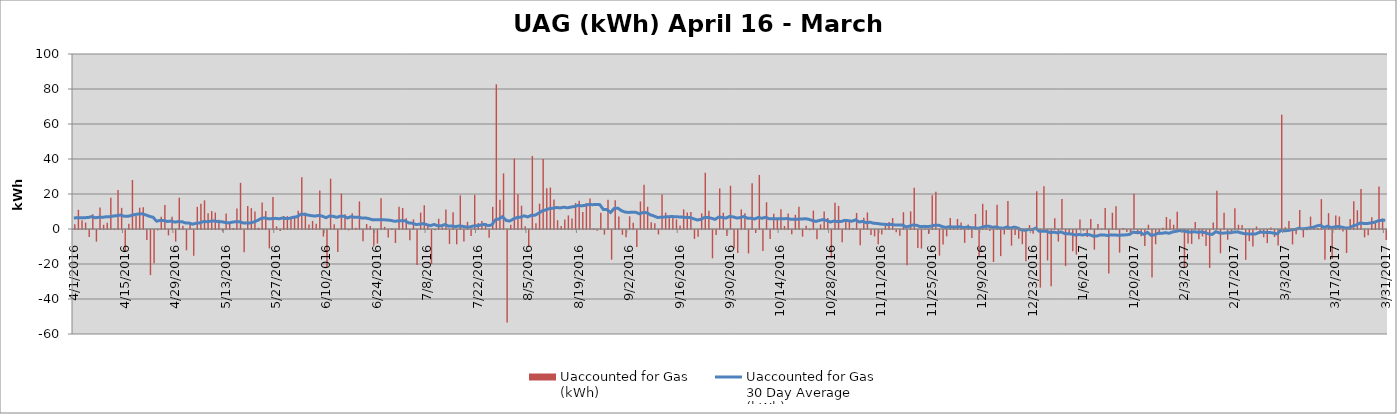
| Category | Uaccounted for Gas 
(kWh) |
|---|---|
| 4/1/16 | 2747858 |
| 4/2/16 | 10987249 |
| 4/3/16 | 4971341 |
| 4/4/16 | 3717906 |
| 4/5/16 | -4013065.802 |
| 4/6/16 | 8357660 |
| 4/7/16 | -6666343 |
| 4/8/16 | 12330200.741 |
| 4/9/16 | 2411081 |
| 4/10/16 | 3610171 |
| 4/11/16 | 17916954 |
| 4/12/16 | -39979.679 |
| 4/13/16 | 22291129 |
| 4/14/16 | 12089341 |
| 4/15/16 | -12388308.773 |
| 4/16/16 | 2954956 |
| 4/17/16 | 28032356 |
| 4/18/16 | 7630106 |
| 4/19/16 | 12194986 |
| 4/20/16 | 12359151 |
| 4/21/16 | -5673006 |
| 4/22/16 | -25780924.809 |
| 4/23/16 | -18972085 |
| 4/24/16 | -218906 |
| 4/25/16 | 6956983 |
| 4/26/16 | 13717920.634 |
| 4/27/16 | -3056522.309 |
| 4/28/16 | 6942178.857 |
| 4/29/16 | -6624262 |
| 4/30/16 | 17928392 |
| 5/1/16 | 1872096 |
| 5/2/16 | -11613748 |
| 5/3/16 | 2883097 |
| 5/4/16 | -14722521 |
| 5/5/16 | 12671728 |
| 5/6/16 | 14473853 |
| 5/7/16 | 16383154 |
| 5/8/16 | 9026183 |
| 5/9/16 | 10286304 |
| 5/10/16 | 9417301 |
| 5/11/16 | 5223985 |
| 5/12/16 | -739234 |
| 5/13/16 | 8892697.646 |
| 5/14/16 | 4005316 |
| 5/15/16 | 564509 |
| 5/16/16 | 11779407 |
| 5/17/16 | 26385147 |
| 5/18/16 | -12736341 |
| 5/19/16 | 13194191 |
| 5/20/16 | 11895440 |
| 5/21/16 | 10004135 |
| 5/22/16 | 726040 |
| 5/23/16 | 15123490 |
| 5/24/16 | 10237784 |
| 5/25/16 | -10526853 |
| 5/26/16 | 18323500 |
| 5/27/16 | 1508032 |
| 5/28/16 | -591883 |
| 5/29/16 | 7375942 |
| 5/30/16 | 7362594 |
| 5/31/16 | 7012977 |
| 6/1/16 | 6890521 |
| 6/2/16 | 10470917 |
| 6/3/16 | 29588070 |
| 6/4/16 | 9401068 |
| 6/5/16 | 2630983 |
| 6/6/16 | 4656331 |
| 6/7/16 | 3021136 |
| 6/8/16 | 21973435 |
| 6/9/16 | -3748070 |
| 6/10/16 | -21179469 |
| 6/11/16 | 28727680 |
| 6/12/16 | 2666875 |
| 6/13/16 | -12593680 |
| 6/14/16 | 20233542 |
| 6/15/16 | 8492768 |
| 6/16/16 | -226227 |
| 6/17/16 | 9038433 |
| 6/18/16 | 758960 |
| 6/19/16 | 15768394 |
| 6/20/16 | -6391839 |
| 6/21/16 | 2816300 |
| 6/22/16 | 1705206.528 |
| 6/23/16 | -8959810.446 |
| 6/24/16 | -7756670 |
| 6/25/16 | 17546263 |
| 6/26/16 | 1254748 |
| 6/27/16 | -4295473 |
| 6/28/16 | 274793 |
| 6/29/16 | -7430974 |
| 6/30/16 | 12727594 |
| 7/1/16 | 12029868 |
| 7/2/16 | 6184016 |
| 7/3/16 | -5812940 |
| 7/4/16 | 5537119.443 |
| 7/5/16 | -19944678.051 |
| 7/6/16 | 9367939 |
| 7/7/16 | 13509380 |
| 7/8/16 | 2721775 |
| 7/9/16 | -19496157 |
| 7/10/16 | -211371 |
| 7/11/16 | 5857602 |
| 7/12/16 | 904832 |
| 7/13/16 | 11076993 |
| 7/14/16 | -7954483 |
| 7/15/16 | 9577253.08 |
| 7/16/16 | -8204924.693 |
| 7/17/16 | 19206296 |
| 7/18/16 | -6580375 |
| 7/19/16 | 4109836.923 |
| 7/20/16 | -3361608 |
| 7/21/16 | 19554120.958 |
| 7/22/16 | 3427693 |
| 7/23/16 | 4627939 |
| 7/24/16 | 3361810 |
| 7/25/16 | -4417997 |
| 7/26/16 | 12638248.667 |
| 7/27/16 | 82671558.278 |
| 7/28/16 | 16765015.111 |
| 7/29/16 | 31766399.556 |
| 7/30/16 | -52867549.333 |
| 7/31/16 | 2458429.722 |
| 8/1/16 | 40289807.083 |
| 8/2/16 | 19871955.028 |
| 8/3/16 | 13271605.361 |
| 8/4/16 | 1631152.944 |
| 8/5/16 | -9380200.417 |
| 8/6/16 | 41777608.028 |
| 8/7/16 | 3333806.778 |
| 8/8/16 | 14466058.611 |
| 8/9/16 | 40070202.222 |
| 8/10/16 | 23232889.944 |
| 8/11/16 | 23718036.611 |
| 8/12/16 | 16890076.056 |
| 8/13/16 | 5003762.833 |
| 8/14/16 | 1677302.389 |
| 8/15/16 | 5374627 |
| 8/16/16 | 7755333.5 |
| 8/17/16 | 6011751.611 |
| 8/18/16 | 14825873.333 |
| 8/19/16 | 16162521.833 |
| 8/20/16 | 9664023.889 |
| 8/21/16 | 14803472.5 |
| 8/22/16 | 17424841.151 |
| 8/23/16 | 251739.523 |
| 8/24/16 | -478101.105 |
| 8/25/16 | 9270874.175 |
| 8/26/16 | -2667414.92 |
| 8/27/16 | 16658694.802 |
| 8/28/16 | -16956096.667 |
| 8/29/16 | 16443772.947 |
| 8/30/16 | 7195898.949 |
| 8/31/16 | -2754980.252 |
| 9/1/16 | -4195728.347 |
| 9/2/16 | 7236869.482 |
| 9/3/16 | 3530846.556 |
| 9/4/16 | -9665146.301 |
| 9/5/16 | 15741645.858 |
| 9/6/16 | 25313352.514 |
| 9/7/16 | 12705757.011 |
| 9/8/16 | 3788272.597 |
| 9/9/16 | 3297311.931 |
| 9/10/16 | -2533696.758 |
| 9/11/16 | 19719957.8 |
| 9/12/16 | 9356695.248 |
| 9/13/16 | 7552068.194 |
| 9/14/16 | 7603537.636 |
| 9/15/16 | 5495453.333 |
| 9/16/16 | 2036538.991 |
| 9/17/16 | 11188610.071 |
| 9/18/16 | 9389365.087 |
| 9/19/16 | 9672062.644 |
| 9/20/16 | -5108918.222 |
| 9/21/16 | -3874894.293 |
| 9/22/16 | 8962838.944 |
| 9/23/16 | 32136790.639 |
| 9/24/16 | 10379700.556 |
| 9/25/16 | -16176274.139 |
| 9/26/16 | -2796131.695 |
| 9/27/16 | 23202057.527 |
| 9/28/16 | 9304400.043 |
| 9/29/16 | -3482010.228 |
| 9/30/16 | 24695513.708 |
| 10/1/16 | -10562901.728 |
| 10/2/16 | -13121929.444 |
| 10/3/16 | 11217482.773 |
| 10/4/16 | 9004987.5 |
| 10/5/16 | -13353679.568 |
| 10/6/16 | 26145448.007 |
| 10/7/16 | -1705756.222 |
| 10/8/16 | 30890607.889 |
| 10/9/16 | -11976613.333 |
| 10/10/16 | 15303461.056 |
| 10/11/16 | -5214165.389 |
| 10/12/16 | 8710887.889 |
| 10/13/16 | 6194697.167 |
| 10/14/16 | 11256169.389 |
| 10/15/16 | 1683467 |
| 10/16/16 | 8926823.389 |
| 10/17/16 | -2366819.722 |
| 10/18/16 | 8116603.111 |
| 10/19/16 | 12738192.389 |
| 10/20/16 | -3812741.631 |
| 10/21/16 | 1914863.633 |
| 10/22/16 | -161652.778 |
| 10/23/16 | 10530595.889 |
| 10/24/16 | -5349969.937 |
| 10/25/16 | 2613667.463 |
| 10/26/16 | 10066118.722 |
| 10/27/16 | 6353070.5 |
| 10/28/16 | -16023222.611 |
| 10/29/16 | 14956836.778 |
| 10/30/16 | 13196413.833 |
| 10/31/16 | -6951657 |
| 11/1/16 | 5590893.889 |
| 11/2/16 | 4896630.278 |
| 11/3/16 | 447556.111 |
| 11/4/16 | 9182955.611 |
| 11/5/16 | -8645903.5 |
| 11/6/16 | 6452780.5 |
| 11/7/16 | 9427150.611 |
| 11/8/16 | -2874319.5 |
| 11/9/16 | -3628275.5 |
| 11/10/16 | -8122816.778 |
| 11/11/16 | -2500252.389 |
| 11/12/16 | 3051498.222 |
| 11/13/16 | 3997684.222 |
| 11/14/16 | 6257648.278 |
| 11/15/16 | -1322268.333 |
| 11/16/16 | -3276376.222 |
| 11/17/16 | 9587427.389 |
| 11/18/16 | -20136285.111 |
| 11/19/16 | 10048616 |
| 11/20/16 | 23569442.556 |
| 11/21/16 | -10239526.167 |
| 11/22/16 | -10604980.278 |
| 11/23/16 | -54751.611 |
| 11/24/16 | -2303136.333 |
| 11/25/16 | 19271363.167 |
| 11/26/16 | 21318233.722 |
| 11/27/16 | -14671256.444 |
| 11/28/16 | -8230982.111 |
| 11/29/16 | -3622603.944 |
| 11/30/16 | 6319067.389 |
| 12/1/16 | 1309623.333 |
| 12/2/16 | 5757946.889 |
| 12/3/16 | 3761495.833 |
| 12/4/16 | -7365564.111 |
| 12/5/16 | 2528649.333 |
| 12/6/16 | -4523977.833 |
| 12/7/16 | 8630032.944 |
| 12/8/16 | -15113093.056 |
| 12/9/16 | 14363784 |
| 12/10/16 | 10765758.722 |
| 12/11/16 | -610812.667 |
| 12/12/16 | -18256860.722 |
| 12/13/16 | 13810599.944 |
| 12/14/16 | -14926308.5 |
| 12/15/16 | -2545649.333 |
| 12/16/16 | 15974253 |
| 12/17/16 | -8980636.556 |
| 12/18/16 | -2843949.444 |
| 12/19/16 | -4984360.278 |
| 12/20/16 | -8115099.556 |
| 12/21/16 | -17829129.333 |
| 12/22/16 | 2263688.889 |
| 12/23/16 | -2115083.222 |
| 12/24/16 | 21535314.667 |
| 12/25/16 | -32939537.944 |
| 12/26/16 | 24433434.222 |
| 12/27/16 | -17432856.5 |
| 12/28/16 | -32169774.444 |
| 12/29/16 | 6183195.667 |
| 12/30/16 | -6596187.389 |
| 12/31/16 | 17134252.111 |
| 1/1/17 | -20597397.944 |
| 1/2/17 | -2104624.111 |
| 1/3/17 | -12181685 |
| 1/4/17 | -14084543 |
| 1/5/17 | 5406819.222 |
| 1/6/17 | -414795.111 |
| 1/7/17 | -4011371.667 |
| 1/8/17 | 5710766.389 |
| 1/9/17 | -11202968 |
| 1/10/17 | 2853704.889 |
| 1/11/17 | 155040.167 |
| 1/12/17 | 11998996.222 |
| 1/13/17 | -24865163.823 |
| 1/14/17 | 9316219.444 |
| 1/15/17 | 12975733.556 |
| 1/16/17 | -12947537 |
| 1/17/17 | 614870.799 |
| 1/18/17 | -1112403.045 |
| 1/19/17 | -1563743.167 |
| 1/20/17 | 20206608.278 |
| 1/21/17 | -2480853.667 |
| 1/22/17 | -3614935.444 |
| 1/23/17 | -9171226.333 |
| 1/24/17 | 2443619.222 |
| 1/25/17 | -27085630.48 |
| 1/26/17 | -8171554.722 |
| 1/27/17 | -2760229.778 |
| 1/28/17 | 755709.222 |
| 1/29/17 | 6855057.222 |
| 1/30/17 | 5562082.944 |
| 1/31/17 | 2441500.833 |
| 2/1/17 | 9864224 |
| 2/2/17 | -158717.305 |
| 2/3/17 | -21634432.064 |
| 2/4/17 | -7778160.925 |
| 2/5/17 | -7950045.818 |
| 2/6/17 | 4017711.428 |
| 2/7/17 | -5275144.515 |
| 2/8/17 | -3656474.611 |
| 2/9/17 | -9147257.556 |
| 2/10/17 | -21684557.611 |
| 2/11/17 | 3704956.167 |
| 2/12/17 | 21887261.389 |
| 2/13/17 | -13284116.889 |
| 2/14/17 | 9239228.944 |
| 2/15/17 | -5586096 |
| 2/16/17 | -649950.222 |
| 2/17/17 | 11881322.611 |
| 2/18/17 | 2426477.778 |
| 2/19/17 | 2282367.389 |
| 2/20/17 | -17048555.667 |
| 2/21/17 | -6382876.056 |
| 2/22/17 | -9457200.5 |
| 2/23/17 | 1430377.889 |
| 2/24/17 | -537241.667 |
| 2/25/17 | -4167016.556 |
| 2/26/17 | -7478267.444 |
| 2/27/17 | 809297.111 |
| 2/28/17 | -3983837.778 |
| 3/1/17 | -8866071.111 |
| 3/2/17 | 65320505.056 |
| 3/3/17 | 1046184.278 |
| 3/4/17 | 4526122.444 |
| 3/5/17 | -8227600.556 |
| 3/6/17 | -2463328.444 |
| 3/7/17 | 10811047.611 |
| 3/8/17 | -4204402.833 |
| 3/9/17 | -73447.667 |
| 3/10/17 | 7075741.167 |
| 3/11/17 | 1264092.278 |
| 3/12/17 | 423902.722 |
| 3/13/17 | 17095740.167 |
| 3/14/17 | -16968579.556 |
| 3/15/17 | 9064636.333 |
| 3/16/17 | -16574910.278 |
| 3/17/17 | 7718662.889 |
| 3/18/17 | 7131378.778 |
| 3/19/17 | -858264.222 |
| 3/20/17 | -13108072.278 |
| 3/21/17 | 5685969.556 |
| 3/22/17 | 15864785 |
| 3/23/17 | 10731268.222 |
| 3/24/17 | 22837857.278 |
| 3/25/17 | -4178393.778 |
| 3/26/17 | -2945436.167 |
| 3/27/17 | 6765886.278 |
| 3/28/17 | 3683013.222 |
| 3/29/17 | 24318779.667 |
| 3/30/17 | 6017148.222 |
| 3/31/17 | -5657030.5 |